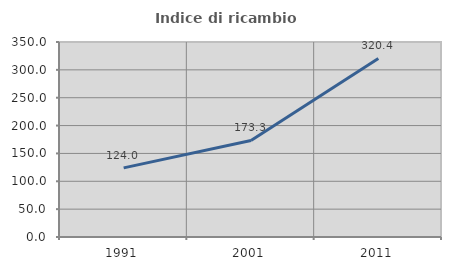
| Category | Indice di ricambio occupazionale  |
|---|---|
| 1991.0 | 124.036 |
| 2001.0 | 173.26 |
| 2011.0 | 320.439 |